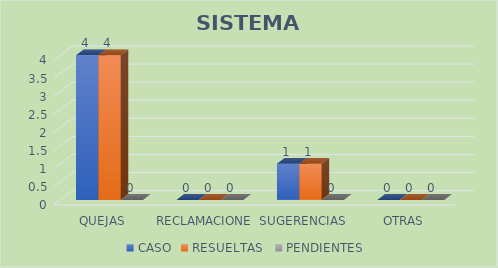
| Category | CASO | RESUELTAS  | PENDIENTES  |
|---|---|---|---|
| QUEJAS | 4 | 4 | 0 |
| RECLAMACIONES | 0 | 0 | 0 |
| SUGERENCIAS | 1 | 1 | 0 |
| OTRAS | 0 | 0 | 0 |